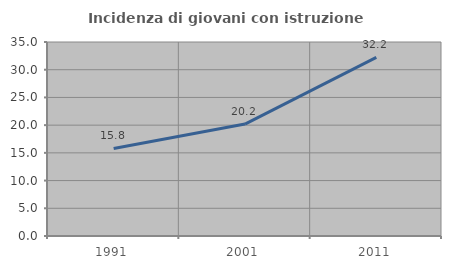
| Category | Incidenza di giovani con istruzione universitaria |
|---|---|
| 1991.0 | 15.792 |
| 2001.0 | 20.193 |
| 2011.0 | 32.24 |